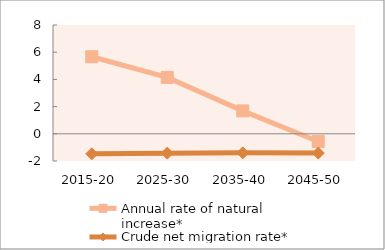
| Category | Annual rate of natural increase* | Crude net migration rate* |
|---|---|---|
| 2015-20 | 5.667 | -1.473 |
| 2025-30 | 4.147 | -1.422 |
| 2035-40 | 1.685 | -1.401 |
| 2045-50 | -0.562 | -1.413 |